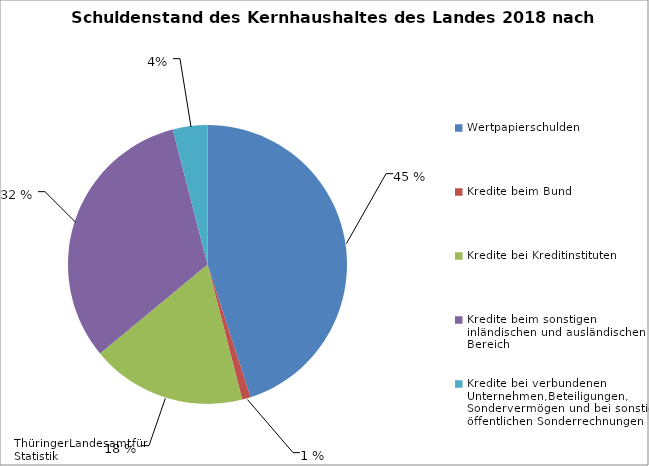
| Category | Series 0 |
|---|---|
| Wertpapierschulden | 45 |
| Kredite beim Bund | 1 |
| Kredite bei Kreditinstituten | 18 |
| Kredite beim sonstigen inländischen und ausländischen Bereich | 32 |
| Kredite bei verbundenen Unternehmen,Beteiligungen, Sondervermögen und bei sonstigen öffentlichen Sonderrechnungen | 4 |